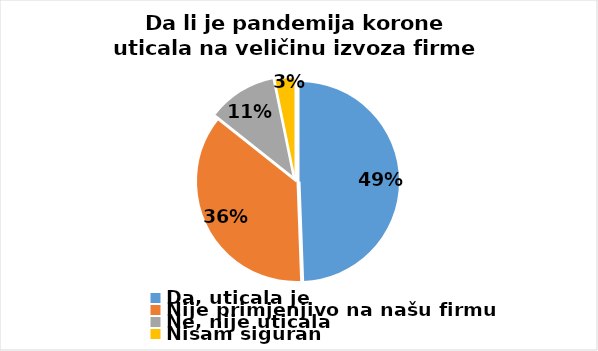
| Category | Series 0 |
|---|---|
| Da, uticala je | 169 |
| Nije primjenjivo na našu firmu | 124 |
| Ne, nije uticala | 38 |
| Nisam siguran | 11 |